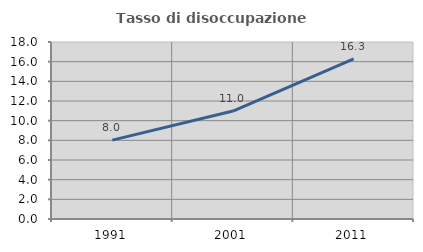
| Category | Tasso di disoccupazione giovanile  |
|---|---|
| 1991.0 | 8.025 |
| 2001.0 | 10.976 |
| 2011.0 | 16.279 |